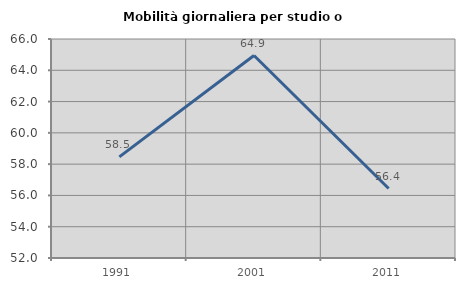
| Category | Mobilità giornaliera per studio o lavoro |
|---|---|
| 1991.0 | 58.462 |
| 2001.0 | 64.943 |
| 2011.0 | 56.442 |